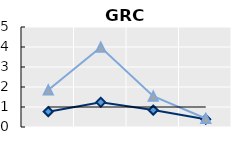
| Category | Public goods | Individual items only | Series 1 |
|---|---|---|---|
| 15-24 | 0.767 | 1.853 | 1 |
| 25-54 | 1.24 | 3.985 | 1 |
| 55-64 | 0.845 | 1.543 | 1 |
| 65+ | 0.391 | 0.424 | 1 |